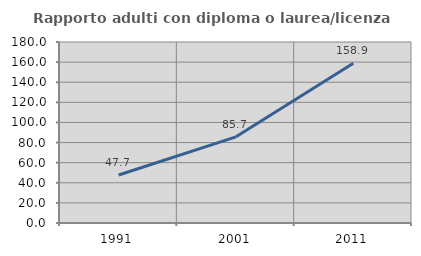
| Category | Rapporto adulti con diploma o laurea/licenza media  |
|---|---|
| 1991.0 | 47.692 |
| 2001.0 | 85.714 |
| 2011.0 | 158.904 |